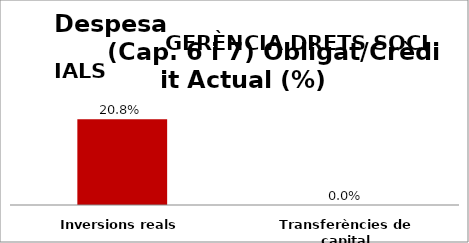
| Category | Series 0 |
|---|---|
| Inversions reals | 0.208 |
| Transferències de capital | 0 |